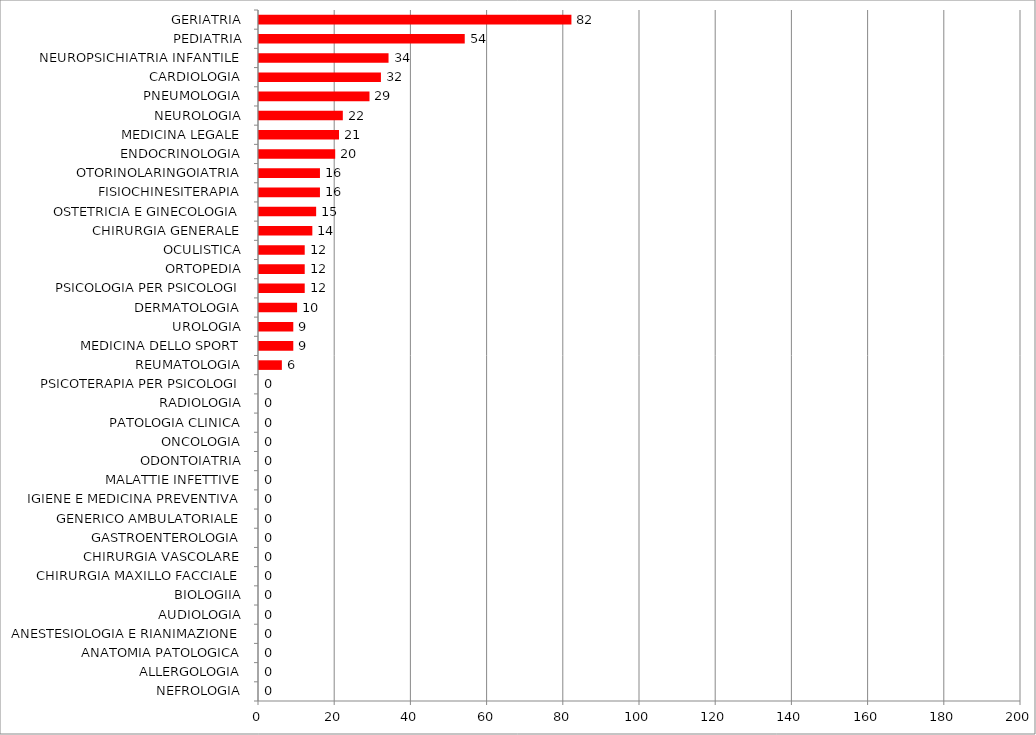
| Category | Series 0 |
|---|---|
| NEFROLOGIA | 0 |
| ALLERGOLOGIA | 0 |
| ANATOMIA PATOLOGICA | 0 |
| ANESTESIOLOGIA E RIANIMAZIONE | 0 |
| AUDIOLOGIA | 0 |
| BIOLOGIIA | 0 |
| CHIRURGIA MAXILLO FACCIALE | 0 |
| CHIRURGIA VASCOLARE | 0 |
| GASTROENTEROLOGIA | 0 |
| GENERICO AMBULATORIALE | 0 |
| IGIENE E MEDICINA PREVENTIVA | 0 |
| MALATTIE INFETTIVE | 0 |
| ODONTOIATRIA | 0 |
| ONCOLOGIA | 0 |
| PATOLOGIA CLINICA | 0 |
| RADIOLOGIA | 0 |
| PSICOTERAPIA PER PSICOLOGI | 0 |
| REUMATOLOGIA | 6 |
| MEDICINA DELLO SPORT | 9 |
| UROLOGIA | 9 |
| DERMATOLOGIA | 10 |
| PSICOLOGIA PER PSICOLOGI | 12 |
| ORTOPEDIA | 12 |
| OCULISTICA | 12 |
| CHIRURGIA GENERALE | 14 |
| OSTETRICIA E GINECOLOGIA | 15 |
| FISIOCHINESITERAPIA | 16 |
| OTORINOLARINGOIATRIA | 16 |
| ENDOCRINOLOGIA | 20 |
| MEDICINA LEGALE | 21 |
| NEUROLOGIA | 22 |
| PNEUMOLOGIA | 29 |
| CARDIOLOGIA | 32 |
| NEUROPSICHIATRIA INFANTILE | 34 |
| PEDIATRIA | 54 |
| GERIATRIA | 82 |